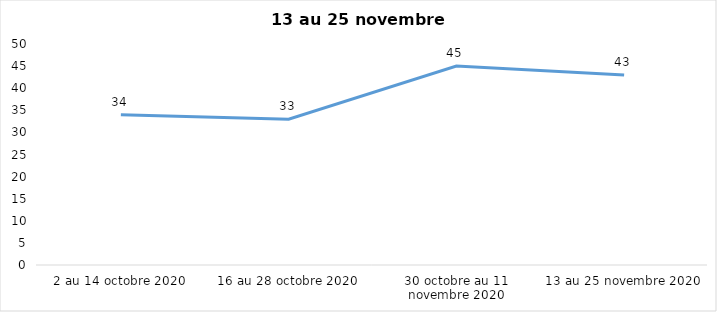
| Category | Series 0 |
|---|---|
| 2 au 14 octobre 2020 | 34 |
| 16 au 28 octobre 2020 | 33 |
| 30 octobre au 11 novembre 2020 | 45 |
| 13 au 25 novembre 2020 | 43 |